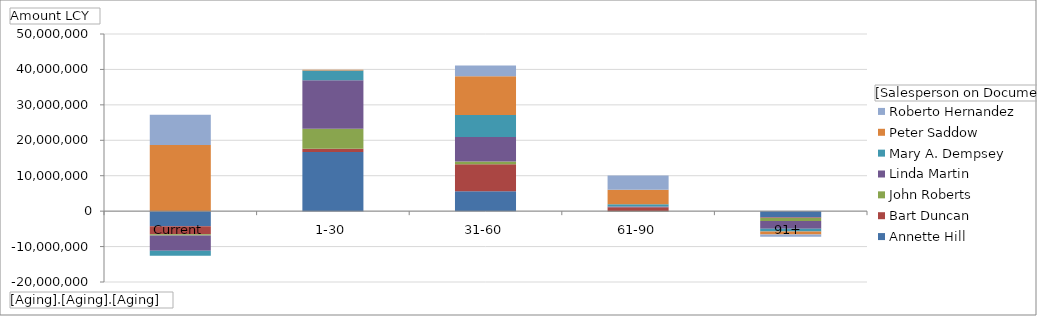
| Category | Annette Hill | Bart Duncan | John Roberts | Linda Martin | Mary A. Dempsey | Peter Saddow | Roberto Hernandez |
|---|---|---|---|---|---|---|---|
| Current | -4264840.94 | -2261618.34 | -344585.71 | -4289765.6 | -1443023.85 | 18696239.07 | 8501481.3 |
| 1-30 | 16696710.07 | 901942.94 | 5634097.92 | 13707043.26 | 2788176.53 | 207679.78 | -136883.7 |
| 31-60 | 5602392.88 | 7633083.15 | 790134.14 | 6877994.33 | 6232997.05 | 10924891.43 | 3036043.41 |
| 61-90 | -103035.22 | 1070350.77 | -49440.97 | 245852.47 | 659347.23 | 4079197.74 | 3985940.42 |
| 91+ | -1767283.82 | -188835.17 | -810841 | -2190547.41 | -791139.97 | -815072.27 | -651150.52 |